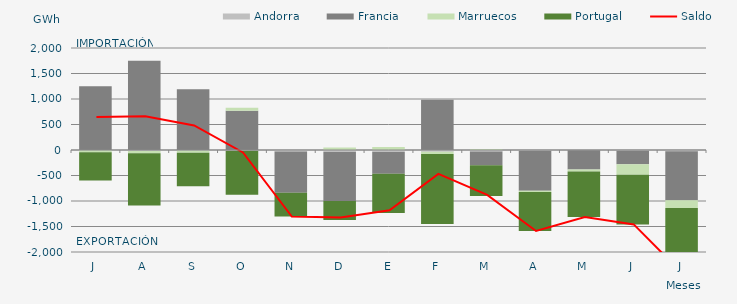
| Category | Andorra | Francia | Marruecos | Portugal |
|---|---|---|---|---|
| J | -3.551 | 1247.95 | -38.635 | -558.283 |
| A | -19.02 | 1750.608 | -45.265 | -1025.301 |
| S | -11.131 | 1193.426 | -45.19 | -654.794 |
| O | -15.195 | 769.066 | 59.008 | -860.78 |
| N | -28.632 | -809.352 | -1.998 | -465.164 |
| D | -40.654 | -959.109 | 48.514 | -372.253 |
| E | -38.484 | -427.138 | 57.119 | -771.475 |
| F | -34.803 | 984.059 | -44.168 | -1373 |
| M | -31.125 | -269.835 | 22.023 | -601.362 |
| A | -16.536 | -782.902 | -22.588 | -764.882 |
| M | -5.354 | -378.945 | -37.987 | -891.537 |
| J | -16.539 | -262.937 | -205.078 | -974.176 |
| J | -22.256 | -963.789 | -152.863 | -1283.78 |